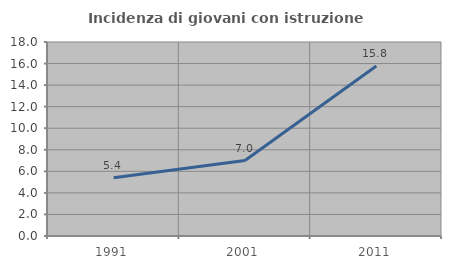
| Category | Incidenza di giovani con istruzione universitaria |
|---|---|
| 1991.0 | 5.414 |
| 2001.0 | 7.001 |
| 2011.0 | 15.776 |